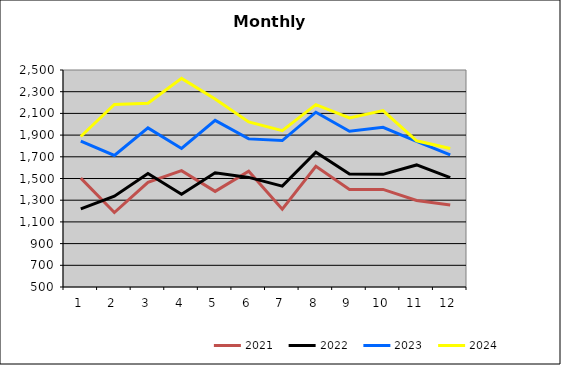
| Category | 2021 | 2022 | 2023 | 2024 |
|---|---|---|---|---|
| 0 | 1503.68 | 1219.945 | 1844.318 | 1887.12 |
| 1 | 1186.293 | 1336.681 | 1712.41 | 2182.42 |
| 2 | 1464.516 | 1545.46 | 1966.844 | 2193.277 |
| 3 | 1572.076 | 1354.89 | 1776.83 | 2422.933 |
| 4 | 1381.3 | 1552.185 | 2036.149 | 2233.348 |
| 5 | 1567.527 | 1510.185 | 1865.135 | 2021.247 |
| 6 | 1216.971 | 1429.988 | 1849.967 | 1941.255 |
| 7 | 1613.137 | 1742.939 | 2111.02 | 2181.117 |
| 8 | 1398.947 | 1540.494 | 1935.176 | 2057.462 |
| 9 | 1399.401 | 1538.281 | 1971.471 | 2125.475 |
| 10 | 1297.013 | 1625.039 | 1842.128 | 1847.576 |
| 11 | 1256.018 | 1508.631 | 1716.881 | 1776.062 |